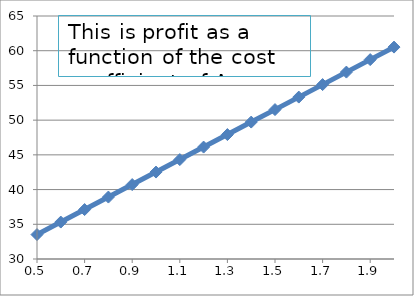
| Category | Series 0 |
|---|---|
| 0.5 | 33.52 |
| 0.6 | 35.32 |
| 0.7 | 37.12 |
| 0.8 | 38.92 |
| 0.9 | 40.72 |
| 1.0 | 42.52 |
| 1.1 | 44.32 |
| 1.2 | 46.12 |
| 1.3 | 47.92 |
| 1.4 | 49.72 |
| 1.5 | 51.52 |
| 1.6 | 53.32 |
| 1.7 | 55.12 |
| 1.8 | 56.92 |
| 1.9 | 58.72 |
| 2.0 | 60.52 |